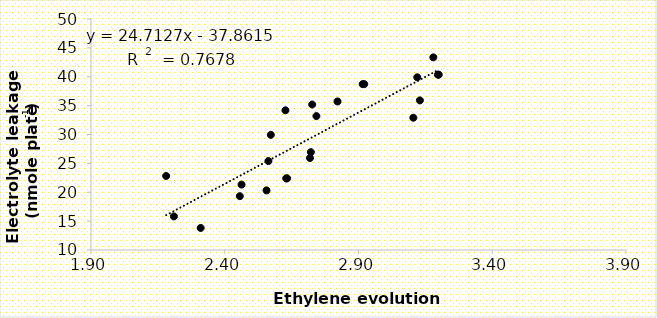
| Category | Electrolyte leakage  |
|---|---|
| 3.197 | 40.36 |
| 3.1195 | 39.906 |
| 2.9155 | 38.721 |
| 2.7268372 | 35.189 |
| 2.7186428 | 25.939 |
| 2.629668828 | 22.401 |
| 2.46277213972 | 21.322 |
| 2.181 | 22.816 |
| 3.1797 | 43.36 |
| 3.1295 | 35.906 |
| 2.92155 | 38.721 |
| 2.74268372 | 33.189 |
| 2.72186428 | 26.939 |
| 2.6329668828 | 22.401 |
| 2.456277213972 | 19.322 |
| 2.21 | 15.816 |
| 3.2 | 40.36 |
| 3.105 | 32.906 |
| 2.82155 | 35.721 |
| 2.6268372 | 34.189 |
| 2.572186428 | 29.939 |
| 2.56329668828 | 25.401 |
| 2.556277213972 | 20.322 |
| 2.31 | 13.816 |